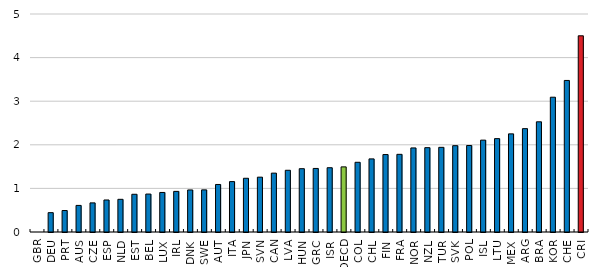
| Category | 2018 |
|---|---|
| GBR | 0 |
| DEU | 0.443 |
| PRT | 0.492 |
| AUS | 0.61 |
| CZE | 0.668 |
| ESP | 0.735 |
| NLD | 0.749 |
| EST | 0.865 |
| BEL | 0.87 |
| LUX | 0.907 |
| IRL | 0.932 |
| DNK | 0.965 |
| SWE | 0.966 |
| AUT | 1.09 |
| ITA | 1.156 |
| JPN | 1.232 |
| SVN | 1.258 |
| CAN | 1.35 |
| LVA | 1.416 |
| HUN | 1.452 |
| GRC | 1.458 |
| ISR | 1.474 |
| OECD | 1.493 |
| COL | 1.599 |
| CHL | 1.677 |
| FIN | 1.776 |
| FRA | 1.781 |
| NOR | 1.928 |
| NZL | 1.934 |
| TUR | 1.942 |
| SVK | 1.98 |
| POL | 1.984 |
| ISL | 2.107 |
| LTU | 2.142 |
| MEX | 2.251 |
| ARG | 2.37 |
| BRA | 2.527 |
| KOR | 3.092 |
| CHE | 3.476 |
| CRI | 4.5 |